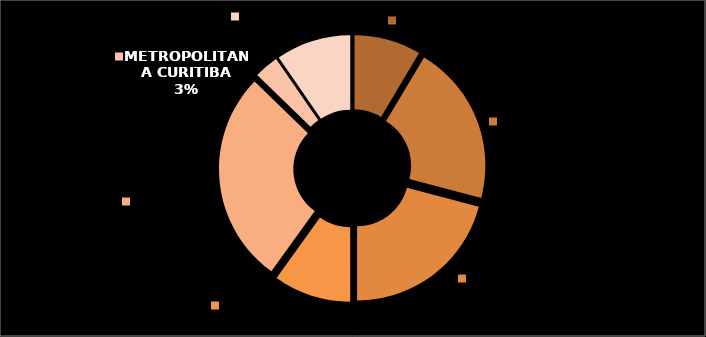
| Category | Series 0 |
|---|---|
| CENTRO ORIENTAL | 270020 |
| CENTRO SUL | 647860 |
| NORTE CENTRAL | 657367 |
| NORTE PIONEIRO | 313051 |
| SUDOESTE | 861003 |
| METROPOLITANA | 98566 |
| NOROESTE | 302807.84 |